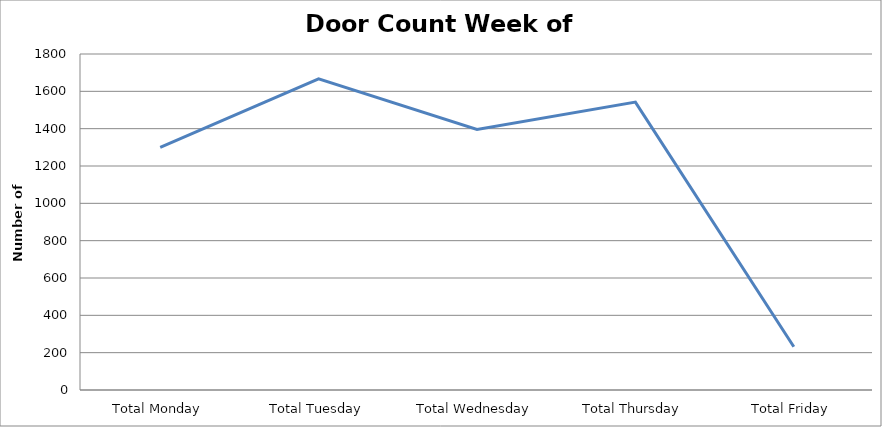
| Category | Series 0 |
|---|---|
| Total Monday | 1300 |
| Total Tuesday | 1666.5 |
| Total Wednesday | 1396 |
| Total Thursday | 1542.5 |
| Total Friday | 232 |